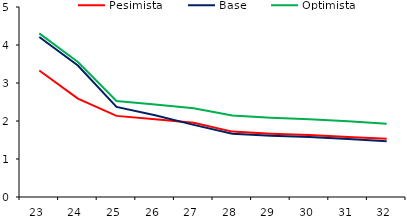
| Category | Pesimista | Base | Optimista |
|---|---|---|---|
| 23.0 | 3.329 | 4.212 | 4.305 |
| 24.0 | 2.59 | 3.459 | 3.551 |
| 25.0 | 2.135 | 2.372 | 2.524 |
| 26.0 | 2.049 | 2.153 | 2.436 |
| 27.0 | 1.954 | 1.898 | 2.338 |
| 28.0 | 1.721 | 1.666 | 2.145 |
| 29.0 | 1.667 | 1.613 | 2.088 |
| 30.0 | 1.63 | 1.577 | 2.048 |
| 31.0 | 1.582 | 1.525 | 1.992 |
| 32.0 | 1.53 | 1.467 | 1.93 |